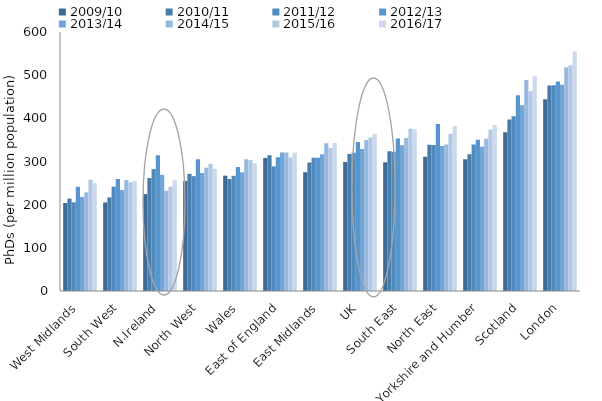
| Category | 2009/10 | 2010/11 | 2011/12 | 2012/13 | 2013/14 | 2014/15 | 2015/16 | 2016/17 |
|---|---|---|---|---|---|---|---|---|
| West Midlands | 203.92 | 213.953 | 205.572 | 241.41 | 217.909 | 228.497 | 258.14 | 249.97 |
| South West | 205.272 | 216.948 | 241.587 | 259.405 | 234.175 | 256.78 | 251.949 | 254.528 |
| N.Ireland | 224.402 | 261.809 | 282.408 | 314.259 | 268.949 | 232.232 | 241.663 | 256.575 |
| North West | 254.989 | 271.4 | 266.074 | 305.483 | 273.377 | 285.706 | 294.85 | 283.112 |
| Wales | 267.213 | 259.482 | 266.745 | 287.114 | 274.903 | 304.927 | 303.546 | 295.981 |
| East of England | 308.227 | 314.718 | 288.694 | 309.985 | 320.742 | 320.935 | 309.186 | 320.18 |
| East Midlands | 275.121 | 297.527 | 308.683 | 308.796 | 316.988 | 342.07 | 331.189 | 342.645 |
| UK | 298.6 | 317.531 | 320.148 | 345.446 | 329.042 | 349.716 | 355.608 | 364.097 |
| South East | 298.445 | 323.595 | 322.64 | 353.114 | 337.503 | 354.214 | 375.957 | 373.866 |
| North East | 311.183 | 338.931 | 338.149 | 386.884 | 336.045 | 339.099 | 364.105 | 381.896 |
| Yorkshire and Humber | 305.435 | 316.743 | 339.484 | 350.325 | 333.949 | 352.492 | 374.166 | 384.397 |
| Scotland | 367.717 | 397.177 | 404.622 | 453.291 | 430.099 | 488.554 | 462.56 | 497.714 |
| London | 444.086 | 475.964 | 476.603 | 485.298 | 477.785 | 518.063 | 522.823 | 554.674 |